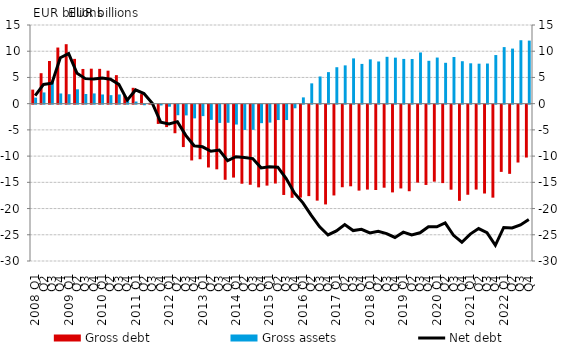
| Category | Gross debt | Gross assets |
|---|---|---|
| 2008 Q1 | 2.678 | 1.155 |
| Q2 | 5.81 | 2.14 |
| Q3 | 8.134 | 4.229 |
| Q4 | 10.703 | 1.946 |
| 2009 Q1 | 11.342 | 1.807 |
| Q2 | 8.54 | 2.745 |
| Q3 | 6.618 | 1.846 |
| Q4 | 6.671 | 1.952 |
| 2010 Q1 | 6.639 | 1.755 |
| Q2 | 6.289 | 1.626 |
| Q3 | 5.439 | 1.76 |
| Q4 | 1.492 | 0.816 |
| 2011 Q1 | 3.024 | 0.408 |
| Q2 | 1.819 | -0.11 |
| Q3 | 0.155 | 0.068 |
| Q4 | -3.672 | -0.147 |
| 2012 Q1 | -4.278 | -0.388 |
| Q2 | -5.449 | -2.015 |
| Q3 | -8.086 | -2.048 |
| Q4 | -10.636 | -2.611 |
| 2013 Q1 | -10.407 | -2.179 |
| Q2 | -11.977 | -2.897 |
| Q3 | -12.329 | -3.478 |
| Q4 | -14.322 | -3.451 |
| 2014 Q1 | -13.901 | -3.791 |
| Q2 | -15.074 | -4.821 |
| Q3 | -15.274 | -4.798 |
| Q4 | -15.768 | -3.527 |
| 2015 Q1 | -15.435 | -3.419 |
| Q2 | -15.035 | -2.932 |
| Q3 | -17.217 | -2.932 |
| Q4 | -17.762 | -0.688 |
| 2016 Q1 | -17.718 | 1.198 |
| Q2 | -17.437 | 3.873 |
| Q3 | -18.299 | 5.184 |
| Q4 | -19.022 | 6.013 |
| 2017 Q1 | -17.312 | 6.95 |
| Q2 | -15.746 | 7.302 |
| Q3 | -15.563 | 8.633 |
| Q4 | -16.389 | 7.58 |
| 2018 Q1 | -16.188 | 8.451 |
| Q2 | -16.273 | 8.045 |
| Q3 | -15.833 | 8.935 |
| Q4 | -16.729 | 8.776 |
| 2019 Q1 | -15.976 | 8.531 |
| Q2 | -16.505 | 8.522 |
| Q3 | -14.862 | 9.762 |
| Q4 | -15.307 | 8.175 |
| 2020 Q1 | -14.677 | 8.794 |
| Q2 | -14.956 | 7.793 |
| Q3 | -16.208 | 8.9 |
| Q4 | -18.335 | 8.094 |
| 2021 Q1 | -17.178 | 7.698 |
| Q2 | -16.187 | 7.625 |
| Q3 | -16.941 | 7.653 |
| Q4 | -17.73 | 9.27 |
| 2022 Q1 | -12.817 | 10.787 |
| Q2 | -13.191 | 10.502 |
| Q3 | -11.033 | 12.096 |
| Q4 | -10.082 | 12.025 |